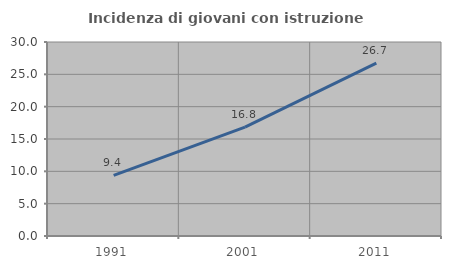
| Category | Incidenza di giovani con istruzione universitaria |
|---|---|
| 1991.0 | 9.381 |
| 2001.0 | 16.834 |
| 2011.0 | 26.721 |